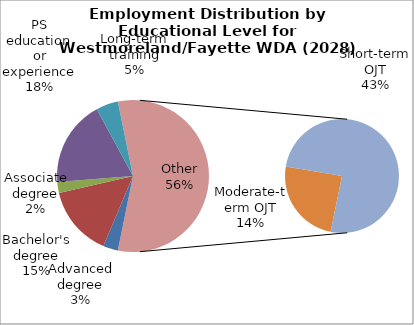
| Category | Series 0 |
|---|---|
| Advanced degree | 6110 |
| Bachelor's degree | 28870 |
| Associate degree | 4460 |
| PS education or experience | 35300 |
| Long-term training | 9010 |
| Moderate-term OJT | 26530 |
| Short-term OJT | 81810 |